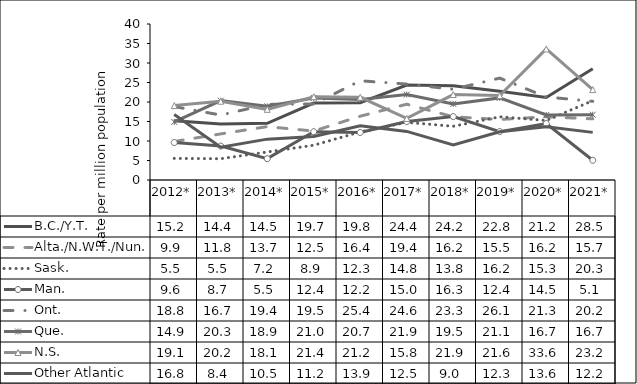
| Category | B.C./Y.T. | Alta./N.W.T./Nun. | Sask. | Man. | Ont. | Que. | N.S. | Other Atlantic |
|---|---|---|---|---|---|---|---|---|
| 2012* | 15.207 | 9.866 | 5.536 | 9.6 | 18.819 | 14.886 | 19.075 | 16.792 |
| 2013* | 14.357 | 11.822 | 5.456 | 8.698 | 16.653 | 20.343 | 20.203 | 8.393 |
| 2014* | 14.544 | 13.69 | 7.188 | 5.473 | 19.387 | 18.895 | 18.113 | 10.479 |
| 2015* | 19.734 | 12.544 | 8.921 | 12.382 | 19.479 | 21.039 | 21.356 | 11.177 |
| 2016* | 19.805 | 16.364 | 12.324 | 12.175 | 25.441 | 20.666 | 21.214 | 13.891 |
| 2017* | 24.351 | 19.429 | 14.778 | 14.984 | 24.591 | 21.922 | 15.788 | 12.454 |
| 2018* | 24.154 | 16.205 | 13.772 | 16.262 | 23.273 | 19.52 | 21.911 | 8.97 |
| 2019* | 22.78 | 15.519 | 16.205 | 12.409 | 26.126 | 21.05 | 21.644 | 12.346 |
| 2020* | 21.15 | 16.206 | 15.263 | 14.486 | 21.294 | 16.67 | 33.609 | 13.644 |
| 2021* | 28.529 | 15.681 | 20.342 | 5.059 | 20.167 | 16.735 | 23.184 | 12.211 |